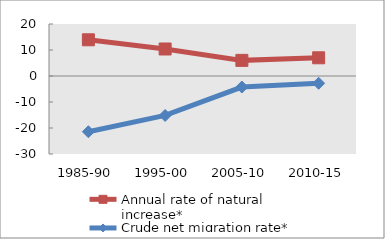
| Category | Annual rate of natural increase* | Crude net migration rate* |
|---|---|---|
| 1985-90 | 13.929 | -21.432 |
| 1995-00 | 10.385 | -15.172 |
| 2005-10 | 6.012 | -4.248 |
| 2010-15 | 7.007 | -2.8 |